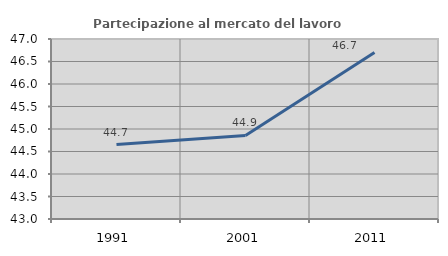
| Category | Partecipazione al mercato del lavoro  femminile |
|---|---|
| 1991.0 | 44.655 |
| 2001.0 | 44.856 |
| 2011.0 | 46.698 |